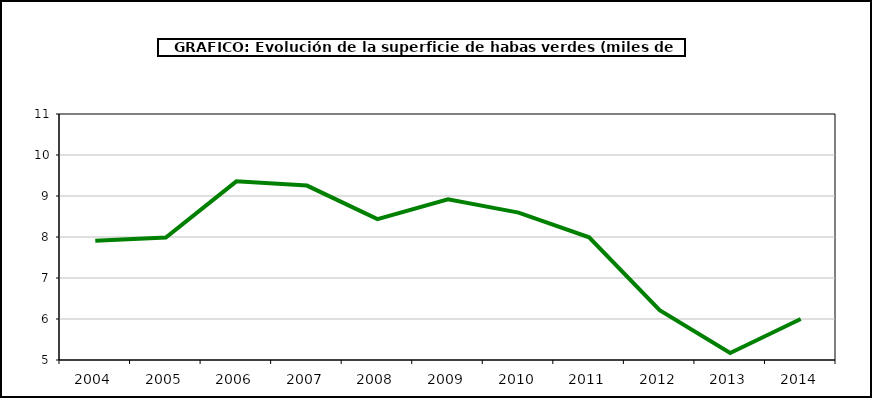
| Category | superficie |
|---|---|
| 2004.0 | 7.906 |
| 2005.0 | 7.989 |
| 2006.0 | 9.358 |
| 2007.0 | 9.254 |
| 2008.0 | 8.436 |
| 2009.0 | 8.92 |
| 2010.0 | 8.595 |
| 2011.0 | 7.993 |
| 2012.0 | 6.216 |
| 2013.0 | 5.17 |
| 2014.0 | 6.001 |